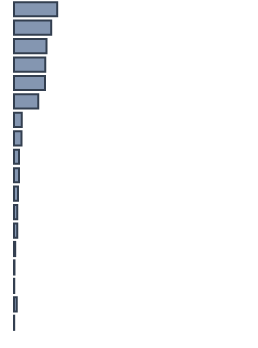
| Category | Percentatge |
|---|---|
| 0 | 18 |
| 1 | 15.5 |
| 2 | 13.5 |
| 3 | 13 |
| 4 | 12.9 |
| 5 | 10.1 |
| 6 | 3.2 |
| 7 | 3.1 |
| 8 | 2.1 |
| 9 | 2.1 |
| 10 | 1.7 |
| 11 | 1.4 |
| 12 | 1.4 |
| 13 | 0.5 |
| 14 | 0.2 |
| 15 | 0.1 |
| 16 | 1.136 |
| 17 | 0.076 |